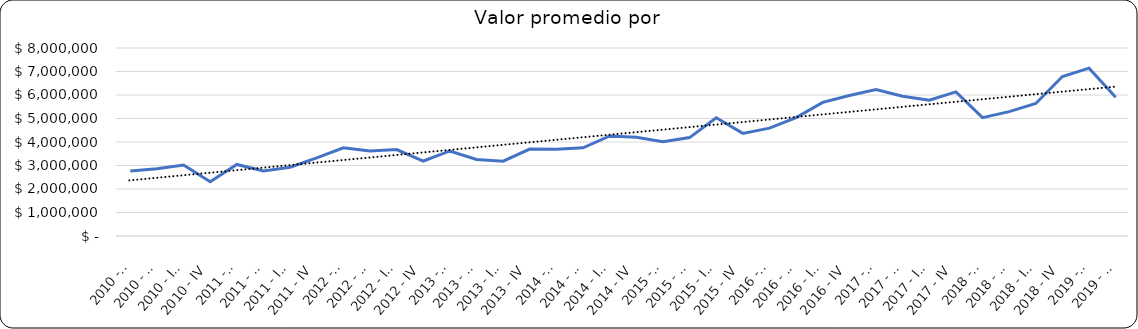
| Category | Valor m2 en Bogotá por sectores |
|---|---|
| 2010 - I | 2765700.483 |
| 2010 - II | 2864758.454 |
| 2010 - III | 3021739.13 |
| 2010 - IV | 2309178.744 |
| 2011 - I | 3045238.095 |
| 2011 - II | 2766666.667 |
| 2011 - III | 2925306.688 |
| 2011 - IV | 3321428.571 |
| 2012 - I | 3750000 |
| 2012 - II | 3619047.619 |
| 2012 - III | 3676190.476 |
| 2012 - IV | 3190476.19 |
| 2013 - I | 3618357.488 |
| 2013 - II | 3255797.101 |
| 2013 - III | 3185990.338 |
| 2013 - IV | 3700483.092 |
| 2014 - I | 3694835.681 |
| 2014 - II | 3751173.709 |
| 2014 - III | 4255868.545 |
| 2014 - IV | 4201877.934 |
| 2015 - I | 4014227.642 |
| 2015 - II | 4186991.87 |
| 2015 - III | 5030487.805 |
| 2015 - IV | 4367886.179 |
| 2016 - I | 4588607.595 |
| 2016 - II | 5039473.684 |
| 2016 - III | 5685714.286 |
| 2016 - IV | 5981433.333 |
| 2017 - I | 6231182.796 |
| 2017 - II | 5946969.697 |
| 2017 - III | 5776804.124 |
| 2017 - IV | 6133514.986 |
| 2018 - I | 5037037.037 |
| 2018 - II | 5294117.647 |
| 2018 - III | 5640000 |
| 2018 - IV | 6785714 |
| 2019 - I | 7142857 |
| 2019 - II | 5899413 |